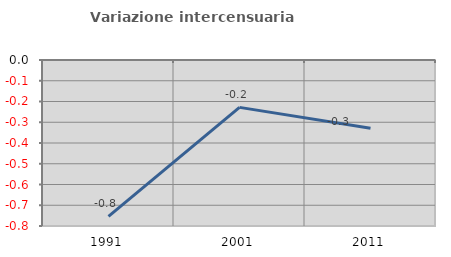
| Category | Variazione intercensuaria annua |
|---|---|
| 1991.0 | -0.753 |
| 2001.0 | -0.228 |
| 2011.0 | -0.329 |